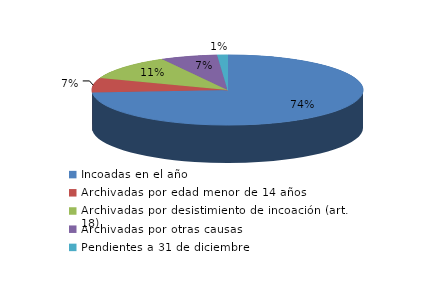
| Category | Series 0 |
|---|---|
| Incoadas en el año | 1747 |
| Archivadas por edad menor de 14 años | 158 |
| Archivadas por desistimiento de incoación (art. 18) | 272 |
| Archivadas por otras causas | 160 |
| Pendientes a 31 de diciembre | 29 |